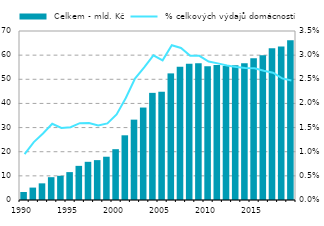
| Category |  Celkem - mld. Kč |
|---|---|
| 1990.0 | 3.325 |
| 1991.0 | 5.141 |
| 1992.0 | 6.899 |
| 1993.0 | 9.446 |
| 1994.0 | 10.027 |
| 1995.0 | 11.555 |
| 1996.0 | 14.14 |
| 1997.0 | 15.816 |
| 1998.0 | 16.52 |
| 1999.0 | 17.926 |
| 2000.0 | 21.05 |
| 2001.0 | 26.8 |
| 2002.0 | 33.286 |
| 2003.0 | 38.294 |
| 2004.0 | 44.377 |
| 2005.0 | 44.84 |
| 2006.0 | 52.443 |
| 2007.0 | 55.225 |
| 2008.0 | 56.469 |
| 2009.0 | 56.654 |
| 2010.0 | 55.433 |
| 2011.0 | 55.872 |
| 2012.0 | 55.547 |
| 2013.0 | 55.799 |
| 2014.0 | 56.658 |
| 2015.0 | 58.692 |
| 2016.0 | 59.982 |
| 2017.0 | 62.825 |
| 2018.0 | 63.535 |
| 2019.0 | 66.14 |